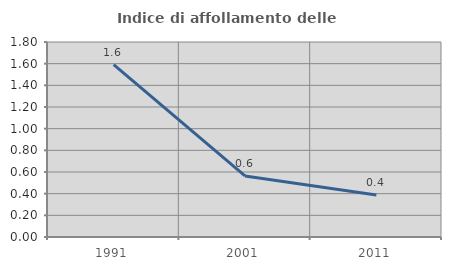
| Category | Indice di affollamento delle abitazioni  |
|---|---|
| 1991.0 | 1.591 |
| 2001.0 | 0.564 |
| 2011.0 | 0.387 |